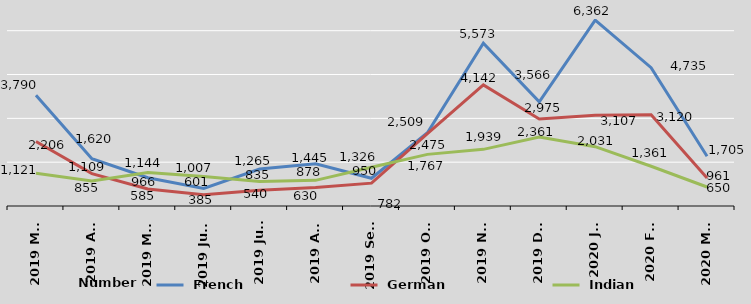
| Category |  French |  German |  Indian |
|---|---|---|---|
| 2019 Mar | 3790 | 2206 | 1121 |
| 2019 Apr | 1620 | 1109 | 855 |
| 2019 May | 966 | 585 | 1144 |
| 2019 June | 601 | 385 | 1007 |
| 2019 July | 1265 | 540 | 835 |
| 2019 Aug | 1445 | 630 | 878 |
| 2019 Sept | 950 | 782 | 1326 |
| 2019 Oct | 2509 | 2475 | 1767 |
| 2019 Nov | 5573 | 4142 | 1939 |
| 2019 Dec | 3566 | 2975 | 2361 |
| 2020 Jan | 6362 | 3107 | 2031 |
| 2020 Feb | 4735 | 3120 | 1361 |
| 2020 Mar | 1705 | 961 | 650 |